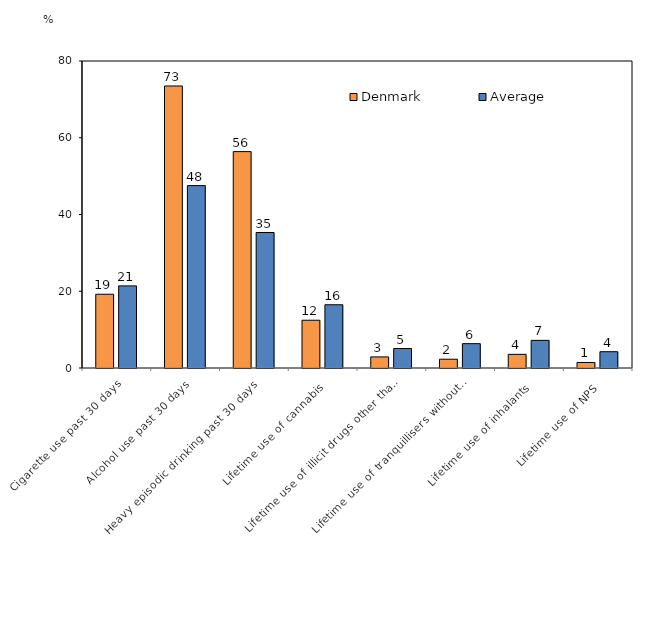
| Category | Denmark | Average |
|---|---|---|
| Cigarette use past 30 days | 19.22 | 21.397 |
| Alcohol use past 30 days | 73.49 | 47.531 |
| Heavy episodic drinking past 30 days | 56.39 | 35.309 |
| Lifetime use of cannabis | 12.45 | 16.48 |
| Lifetime use of illicit drugs other than cannabis | 2.89 | 5.079 |
| Lifetime use of tranquillisers without prescription  | 2.29 | 6.34 |
| Lifetime use of inhalants | 3.56 | 7.202 |
| Lifetime use of NPS | 1.44 | 4.246 |